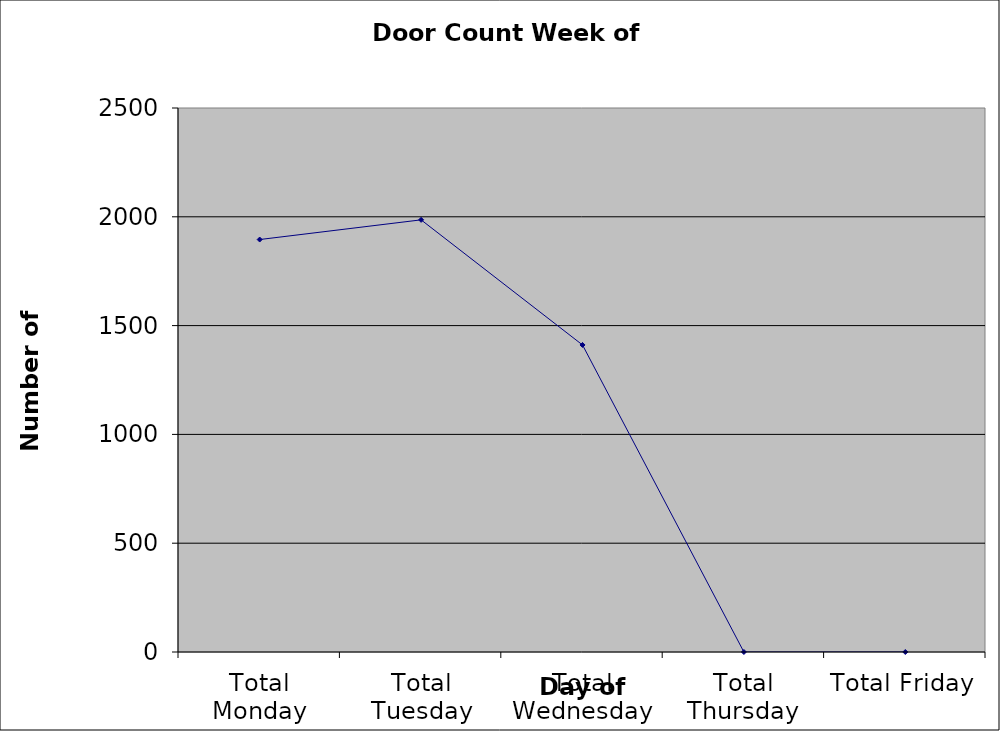
| Category | Series 0 |
|---|---|
| Total Monday | 1895.5 |
| Total Tuesday | 1986 |
| Total Wednesday | 1411 |
| Total Thursday | 0 |
| Total Friday | 0 |